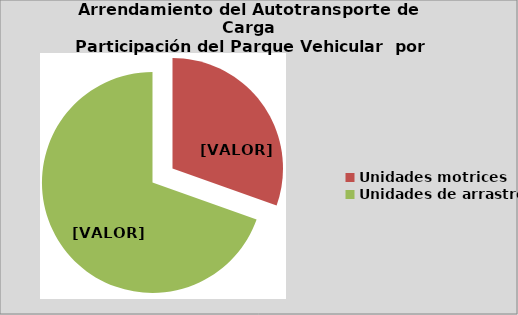
| Category | Series 0 |
|---|---|
| Unidades motrices | 30.445 |
| Unidades de arrastre | 69.555 |